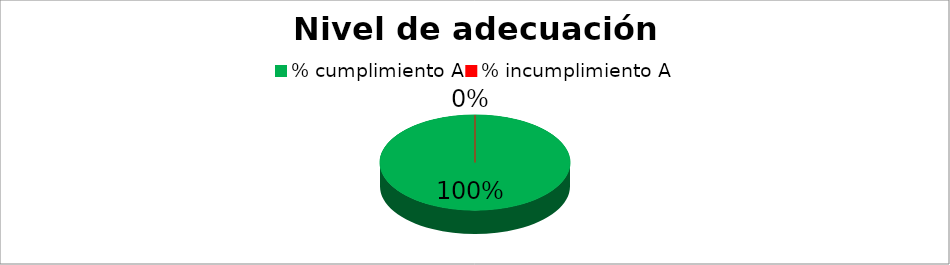
| Category | Series 0 |
|---|---|
| % cumplimiento A | 100 |
| % incumplimiento A | 0 |